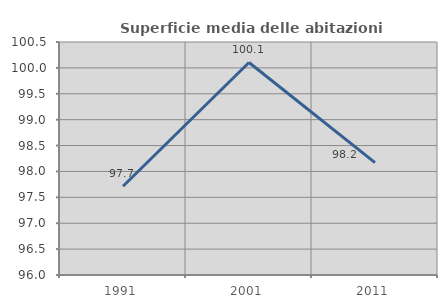
| Category | Superficie media delle abitazioni occupate |
|---|---|
| 1991.0 | 97.715 |
| 2001.0 | 100.105 |
| 2011.0 | 98.171 |